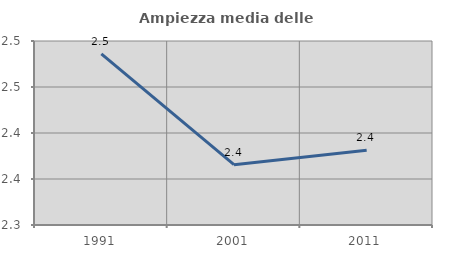
| Category | Ampiezza media delle famiglie |
|---|---|
| 1991.0 | 2.486 |
| 2001.0 | 2.366 |
| 2011.0 | 2.381 |